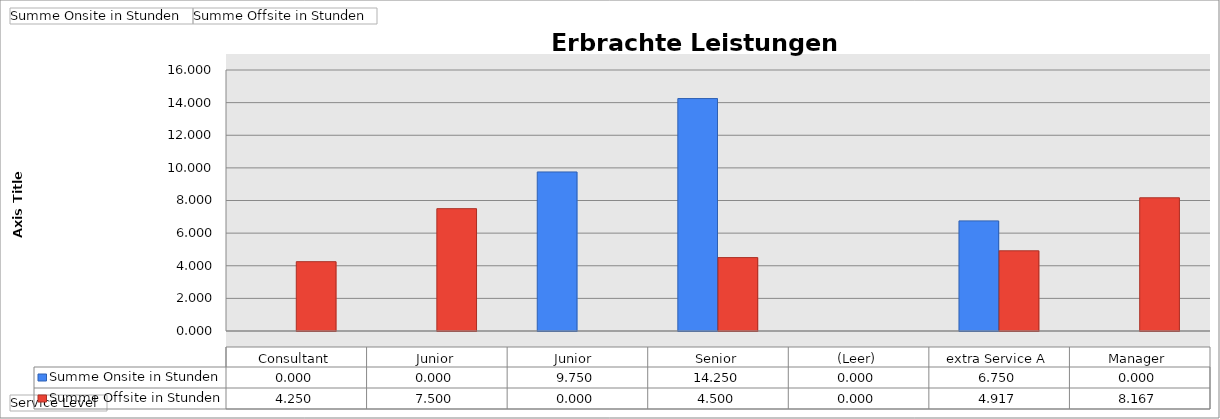
| Category | Summe Onsite in Stunden | Summe Offsite in Stunden |
|---|---|---|
| Consultant | 0 | 4.25 |
| Junior | 0 | 7.5 |
| Junior  | 9.75 | 0 |
| Senior | 14.25 | 4.5 |
| (Leer) | 0 | 0 |
| extra Service A | 6.75 | 4.917 |
| Manager | 0 | 8.167 |